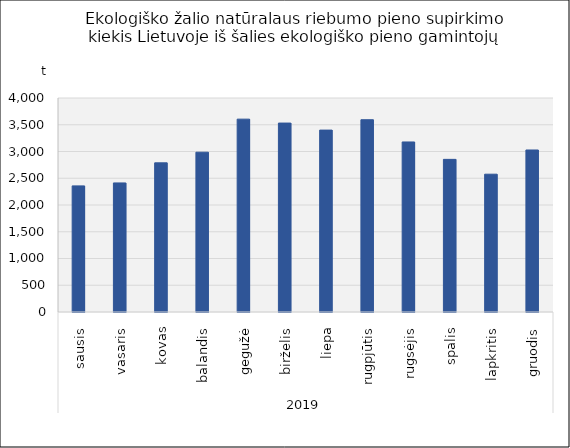
| Category | Ekologiško žalio natūralaus riebumo pieno supirkimo kiekis Lietuvoje iš šalies ekologiško pieno gamintojų |
|---|---|
| 0 | 2357.309 |
| 1 | 2412.599 |
| 2 | 2788.116 |
| 3 | 2986.6 |
| 4 | 3604.557 |
| 5 | 3531.43 |
| 6 | 3399.891 |
| 7 | 3593.969 |
| 8 | 3178.376 |
| 9 | 2853.018 |
| 10 | 2575.8 |
| 11 | 3028.194 |